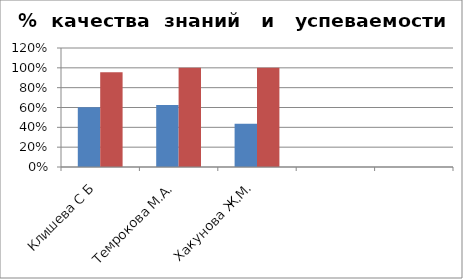
| Category | Series 0 | 2 |
|---|---|---|
| Клишева С Б | 0.603 | 0.956 |
| Темрокова М.А. | 0.625 | 1 |
| Хакунова Ж.М. | 0.436 | 1 |